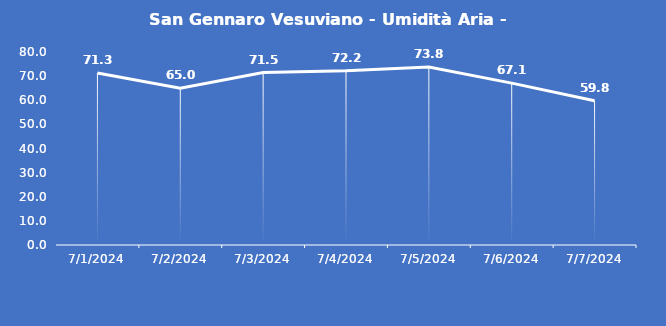
| Category | San Gennaro Vesuviano - Umidità Aria - Grezzo (%) |
|---|---|
| 7/1/24 | 71.3 |
| 7/2/24 | 65 |
| 7/3/24 | 71.5 |
| 7/4/24 | 72.2 |
| 7/5/24 | 73.8 |
| 7/6/24 | 67.1 |
| 7/7/24 | 59.8 |